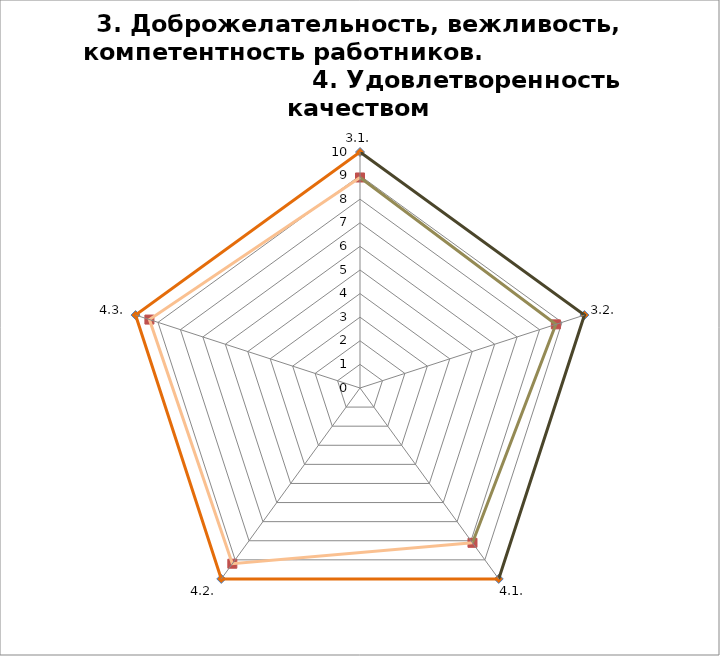
| Category | Series 0 | Series 1 |
|---|---|---|
| 3.1. | 10 | 8.92 |
| 3.2. | 10 | 8.727 |
| 4.1. | 10 | 8.108 |
| 4.2. | 10 | 9.203 |
| 4.3. | 10 | 9.382 |